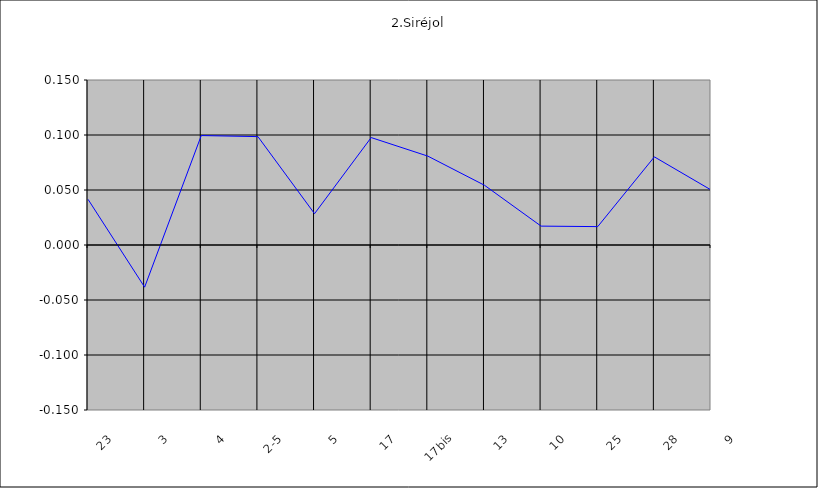
| Category | Siréjo |
|---|---|
| 23 | 0.042 |
| 3 | -0.038 |
| 4 | 0.099 |
| 2-5 | 0.099 |
| 5 | 0.028 |
| 17 | 0.098 |
| 17bis | 0.081 |
| 13 | 0.054 |
| 10 | 0.017 |
| 25 | 0.017 |
| 28 | 0.08 |
| 9 | 0.05 |